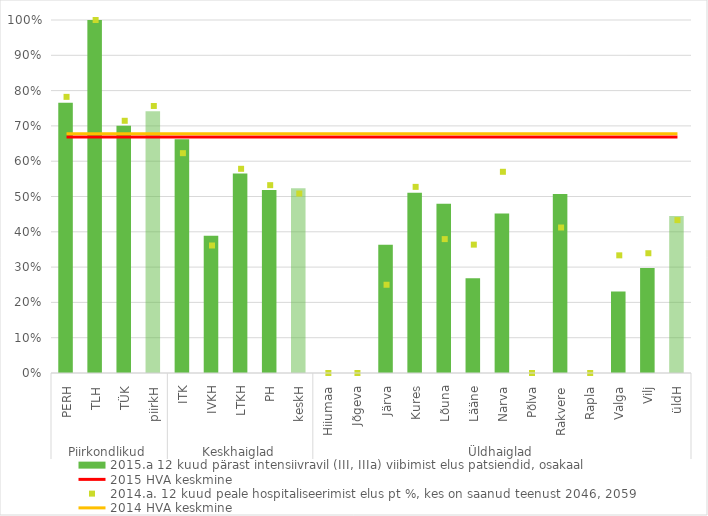
| Category | 2015.a 12 kuud pärast intensiivravil (III, IIIa) viibimist elus patsiendid, osakaal |
|---|---|
| 0 | 0.766 |
| 1 | 1 |
| 2 | 0.701 |
| 3 | 0.741 |
| 4 | 0.662 |
| 5 | 0.389 |
| 6 | 0.565 |
| 7 | 0.518 |
| 8 | 0.524 |
| 9 | 0 |
| 10 | 0 |
| 11 | 0.364 |
| 12 | 0.511 |
| 13 | 0.479 |
| 14 | 0.268 |
| 15 | 0.452 |
| 16 | 0 |
| 17 | 0.507 |
| 18 | 0 |
| 19 | 0.231 |
| 20 | 0.297 |
| 21 | 0.445 |